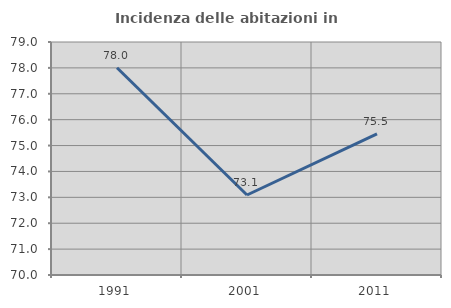
| Category | Incidenza delle abitazioni in proprietà  |
|---|---|
| 1991.0 | 78.004 |
| 2001.0 | 73.09 |
| 2011.0 | 75.45 |